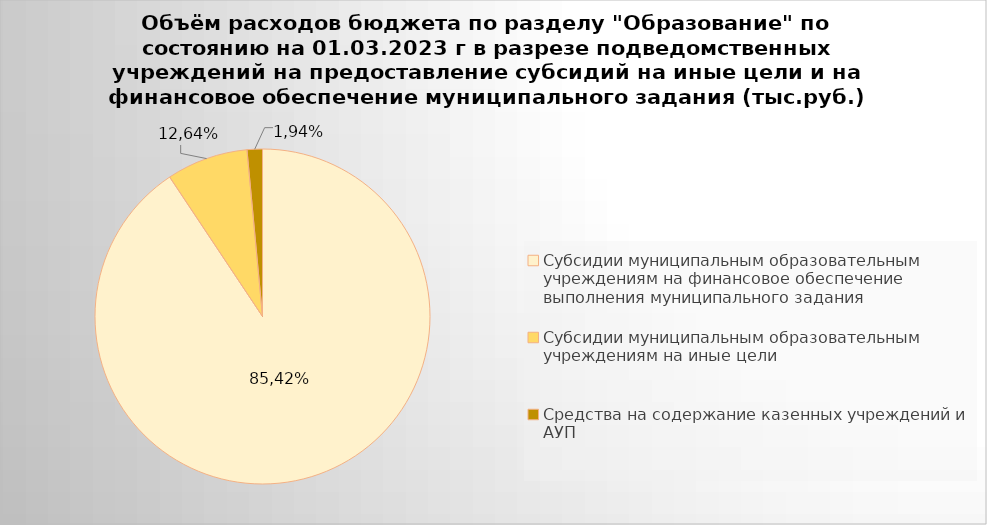
| Category | Series 0 |
|---|---|
| Субсидии муниципальным образовательным учреждениям на финансовое обеспечение выполнения муниципального задания | 7956007.06 |
| Субсидии муниципальным образовательным учреждениям на иные цели | 690736.86 |
| Средства на содержание казенных учреждений и АУП | 129747.54 |